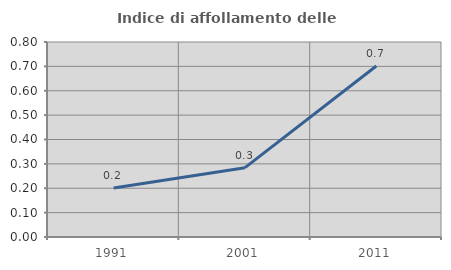
| Category | Indice di affollamento delle abitazioni  |
|---|---|
| 1991.0 | 0.201 |
| 2001.0 | 0.284 |
| 2011.0 | 0.702 |